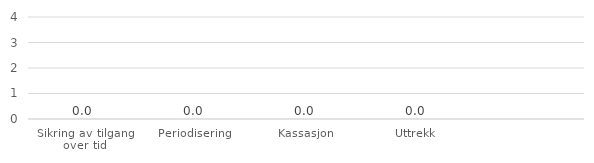
| Category | Series 5 |
|---|---|
| Sikring av tilgang over tid | 0 |
| Periodisering | 0 |
| Kassasjon | 0 |
| Uttrekk | 0 |